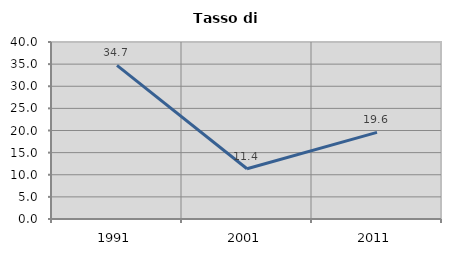
| Category | Tasso di disoccupazione   |
|---|---|
| 1991.0 | 34.724 |
| 2001.0 | 11.354 |
| 2011.0 | 19.573 |